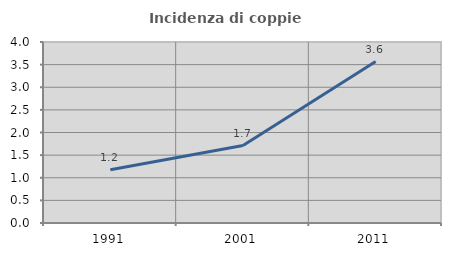
| Category | Incidenza di coppie miste |
|---|---|
| 1991.0 | 1.179 |
| 2001.0 | 1.712 |
| 2011.0 | 3.567 |